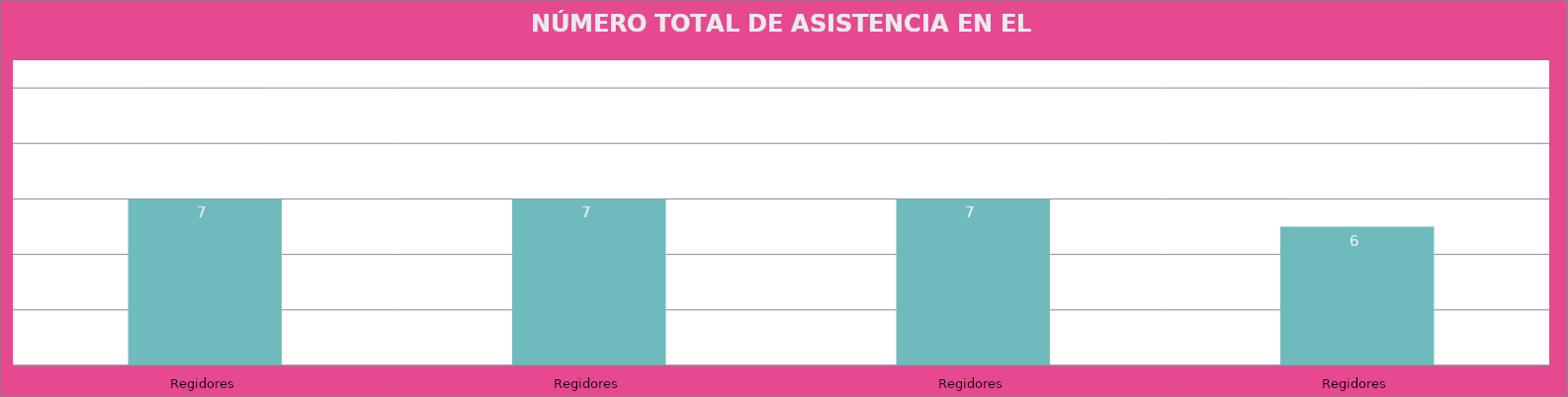
| Category | Regidores |
|---|---|
| Regidores | 7 |
| Regidores | 7 |
| Regidores | 7 |
| Regidores | 6 |